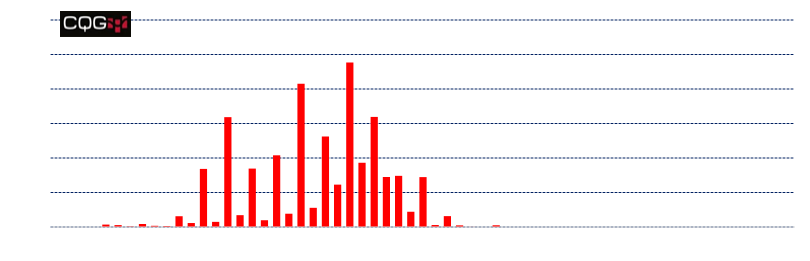
| Category | Series 0 |
|---|---|
| 3700 | 0 |
| 3750 | 0 |
| 3800 | 0 |
| 3850 | 0 |
| 3900 | 70 |
| 3950 | 55 |
| 4000 | 16 |
| 4050 | 87 |
| 4100 | 35 |
| 4150 | 29 |
| 4200 | 312 |
| 4250 | 115 |
| 4300 | 1684 |
| 4350 | 149 |
| 4400 | 3184 |
| 4450 | 343 |
| 4500 | 1693 |
| 4550 | 196 |
| 4600 | 2078 |
| 4650 | 385 |
| 4700 | 4151 |
| 4750 | 556 |
| 4800 | 2624 |
| 4850 | 1228 |
| 4900 | 4771 |
| 4950 | 1862 |
| 5000 | 3191 |
| 5050 | 1449 |
| 5100 | 1483 |
| 5150 | 442 |
| 5200 | 1446 |
| 5250 | 57 |
| 5300 | 315 |
| 5350 | 47 |
| 5400 | 3 |
| 5450 | 0 |
| 5500 | 50 |
| 5550 | 0 |
| 5600 | 0 |
| 5650 | 0 |
| 5700 | 0 |
| 5750 | 0 |
| 5800 | 0 |
| 5850 | 0 |
| 5900 | 0 |
| 5950 | 0 |
| 6000 | 0 |
| 6050 | 0 |
| 6100 | 0 |
| 6150 | 0 |
| 6200 | 0 |
| 6250 | 0 |
| 6300 | 0 |
| 6350 | 0 |
| 6400 | 0 |
| 6450 | 0 |
| 6500 | 0 |
| 6550 | 0 |
| 6600 | 0 |
| 6650 | 0 |
| 6700 | 0 |